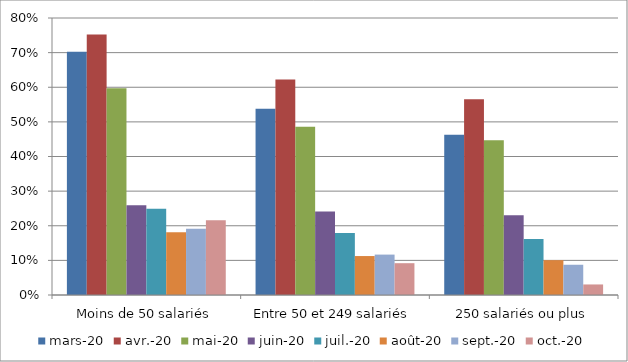
| Category | mars-20 | avr.-20 | mai-20 | juin-20 | juil.-20 | août-20 | sept.-20 | oct.-20 |
|---|---|---|---|---|---|---|---|---|
| Moins de 50 salariés | 0.702 | 0.753 | 0.597 | 0.259 | 0.249 | 0.182 | 0.191 | 0.216 |
| Entre 50 et 249 salariés | 0.538 | 0.622 | 0.486 | 0.241 | 0.179 | 0.112 | 0.117 | 0.092 |
| 250 salariés ou plus | 0.463 | 0.566 | 0.447 | 0.23 | 0.162 | 0.101 | 0.087 | 0.03 |